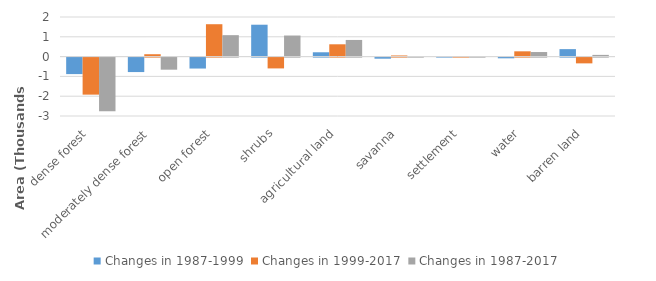
| Category | Changes in 1987-1999 | Changes in 1999-2017 | Changes in 1987-2017 |
|---|---|---|---|
| dense forest | -833.31 | -1870.47 | -2703.78 |
| moderately dense forest | -730.62 | 120.06 | -610.56 |
| open forest | -552.6 | 1635.39 | 1082.79 |
| shrubs | 1610.55 | -546.12 | 1064.43 |
| agricultural land | 218.52 | 621.72 | 840.24 |
| savanna | -54.9 | 56.7 | 1.8 |
| settlement | 0.72 | 7.29 | 8.01 |
| water | -35.73 | 266.49 | 230.76 |
| barren land | 377.37 | -291.06 | 86.31 |